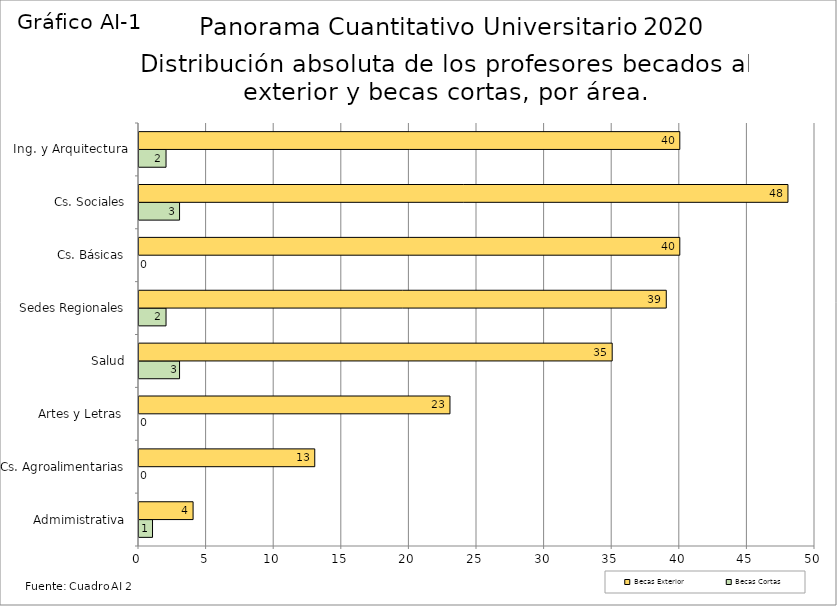
| Category | Becas Cortas | Becas Exterior |
|---|---|---|
| Admimistrativa | 1 | 4 |
| Cs. Agroalimentarias | 0 | 13 |
| Artes y Letras  | 0 | 23 |
| Salud | 3 | 35 |
| Sedes Regionales | 2 | 39 |
| Cs. Básicas | 0 | 40 |
| Cs. Sociales | 3 | 48 |
| Ing. y Arquitectura | 2 | 40 |